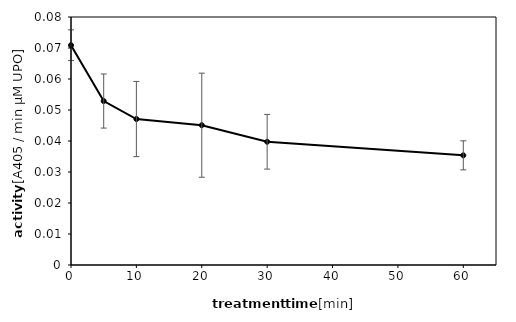
| Category | Series 0 |
|---|---|
| 0.0 | 0.071 |
| 5.0 | 0.053 |
| 10.0 | 0.047 |
| 20.0 | 0.045 |
| 30.0 | 0.04 |
| 60.0 | 0.035 |